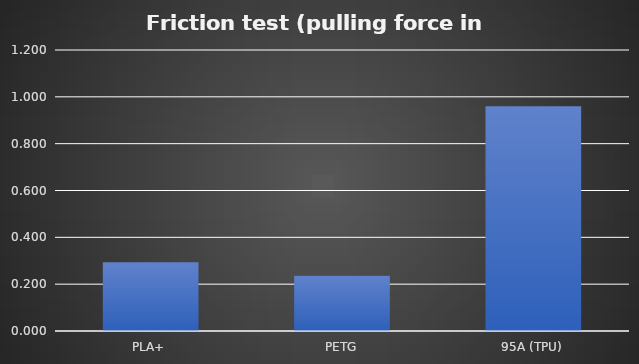
| Category | Average |
|---|---|
| PLA+ | 0.293 |
| PETG | 0.237 |
| 95A (TPU) | 0.96 |